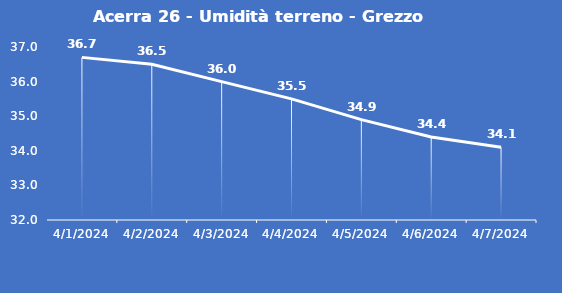
| Category | Acerra 26 - Umidità terreno - Grezzo (%VWC) |
|---|---|
| 4/1/24 | 36.7 |
| 4/2/24 | 36.5 |
| 4/3/24 | 36 |
| 4/4/24 | 35.5 |
| 4/5/24 | 34.9 |
| 4/6/24 | 34.4 |
| 4/7/24 | 34.1 |